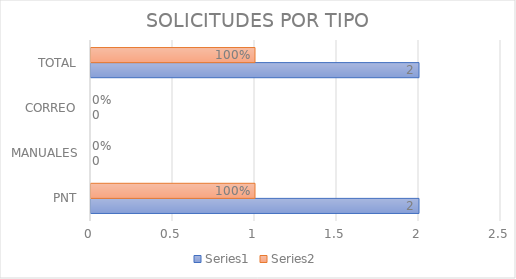
| Category | Series 0 | Series 1 |
|---|---|---|
| PNT | 2 | 1 |
| MANUALES | 0 | 0 |
| CORREO | 0 | 0 |
| TOTAL | 2 | 1 |